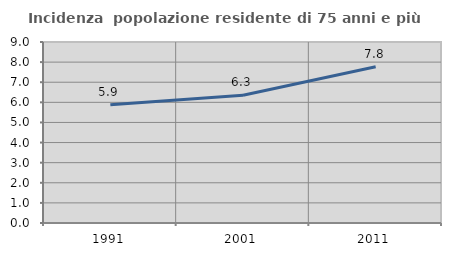
| Category | Incidenza  popolazione residente di 75 anni e più |
|---|---|
| 1991.0 | 5.879 |
| 2001.0 | 6.349 |
| 2011.0 | 7.768 |